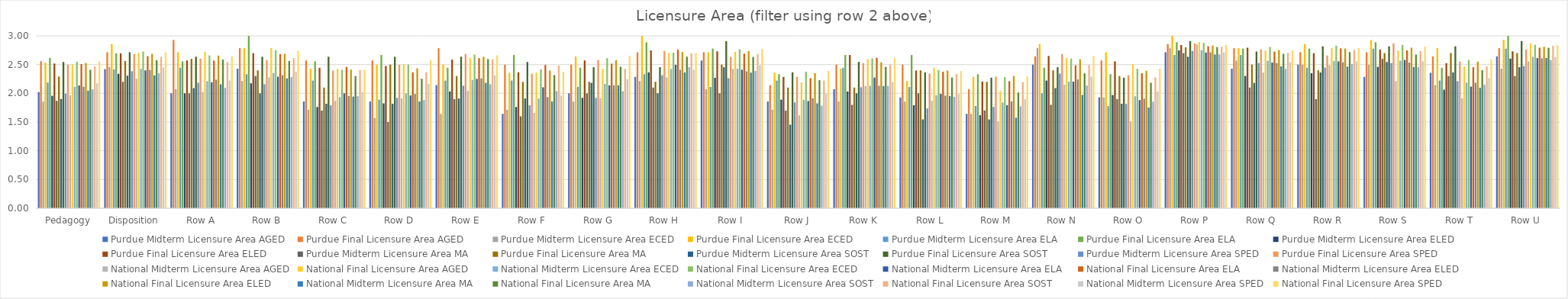
| Category | Purdue | National |
|---|---|---|
| Pedagogy | 2.5 | 2.555 |
| Disposition | 2.684 | 2.712 |
| Row A | 2.605 | 2.642 |
| Row B | 2.579 | 2.74 |
| Row C | 2.395 | 2.413 |
| Row D | 2.5 | 2.576 |
| Row E | 2.684 | 2.66 |
| Row F | 2.342 | 2.375 |
| Row G | 2.579 | 2.649 |
| Row H | 2.737 | 2.7 |
| Row I | 2.632 | 2.776 |
| Row J | 2.29 | 2.39 |
| Row K | 2.526 | 2.611 |
| Row L | 2.342 | 2.387 |
| Row M | 2.29 | 2.294 |
| Row N | 2.684 | 2.65 |
| Row O | 2.316 | 2.427 |
| Row P | 2.868 | 2.843 |
| Row Q | 2.763 | 2.744 |
| Row R | 2.658 | 2.787 |
| Row S | 2.868 | 2.814 |
| Row T | 2.553 | 2.591 |
| Row U | 2.763 | 2.836 |